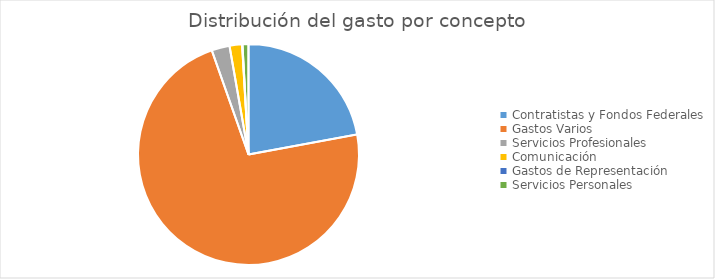
| Category | Series 0 |
|---|---|
| Contratistas y Fondos Federales | 90455009.47 |
| Gastos Varios | 297027948.03 |
| Servicios Profesionales | 10790972.27 |
| Comunicación | 7503022.4 |
| Gastos de Representación | 205145.37 |
| Servicios Personales | 3595871.49 |